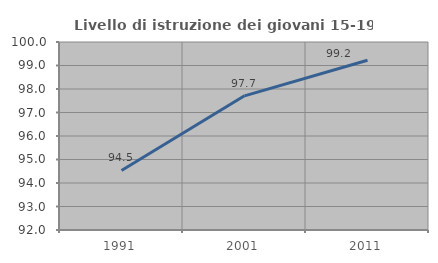
| Category | Livello di istruzione dei giovani 15-19 anni |
|---|---|
| 1991.0 | 94.536 |
| 2001.0 | 97.71 |
| 2011.0 | 99.225 |